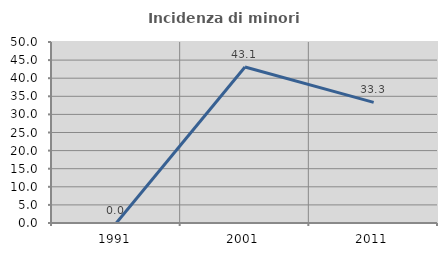
| Category | Incidenza di minori stranieri |
|---|---|
| 1991.0 | 0 |
| 2001.0 | 43.103 |
| 2011.0 | 33.333 |